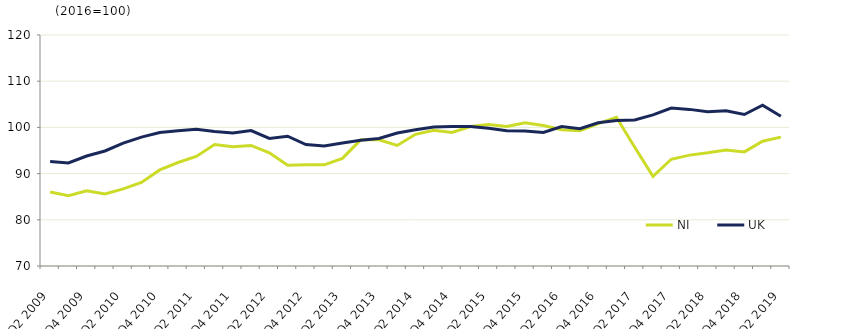
| Category | NI | UK  |
|---|---|---|
| Q2 2009 | 86 | 92.6 |
|  | 85.2 | 92.3 |
| Q4 2009 | 86.3 | 93.8 |
|  | 85.6 | 94.9 |
| Q2 2010 | 86.7 | 96.6 |
|  | 88.1 | 97.9 |
| Q4 2010 | 90.8 | 98.9 |
|  | 92.4 | 99.3 |
| Q2 2011 | 93.7 | 99.6 |
|  | 96.3 | 99.1 |
| Q4 2011 | 95.8 | 98.8 |
|  | 96.1 | 99.3 |
| Q2 2012 | 94.5 | 97.6 |
|  | 91.8 | 98.1 |
| Q4 2012 | 91.9 | 96.3 |
|  | 91.9 | 96 |
| Q2 2013 | 93.3 | 96.6 |
|  | 97.3 | 97.2 |
| Q4 2013 | 97.3 | 97.6 |
|  | 96.1 | 98.8 |
| Q2 2014 | 98.5 | 99.5 |
|  | 99.4 | 100.1 |
| Q4 2014 | 98.9 | 100.2 |
|  | 100.2 | 100.2 |
| Q2 2015 | 100.6 | 99.8 |
|  | 100.2 | 99.3 |
| Q4 2015 | 101 | 99.2 |
|  | 100.4 | 98.9 |
| Q2 2016 | 99.5 | 100.2 |
|  | 99.3 | 99.7 |
| Q4 2016 | 100.8 | 101 |
|  | 102.2 | 101.5 |
| Q2 2017 | 95.7 | 101.6 |
|  | 89.4 | 102.7 |
| Q4 2017 | 93.1 | 104.2 |
|  | 94 | 103.9 |
| Q2 2018 | 94.5 | 103.4 |
|  | 95.1 | 103.6 |
| Q4 2018 | 94.7 | 102.8 |
|  | 97 | 104.8 |
| Q2 2019 | 97.9 | 102.4 |